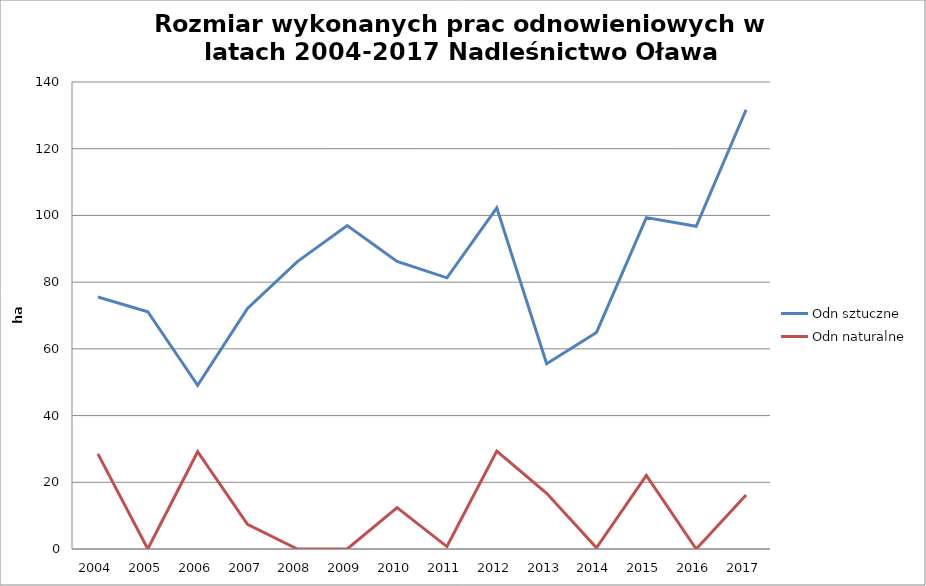
| Category | Odn sztuczne | Odn naturalne |
|---|---|---|
| 2004.0 | 75.55 | 28.52 |
| 2005.0 | 71.13 | 0 |
| 2006.0 | 49.08 | 29.17 |
| 2007.0 | 72.14 | 7.38 |
| 2008.0 | 86.15 | 0 |
| 2009.0 | 96.97 | 0 |
| 2010.0 | 86.23 | 12.41 |
| 2011.0 | 81.3 | 0.73 |
| 2012.0 | 102.29 | 29.37 |
| 2013.0 | 55.54 | 16.68 |
| 2014.0 | 64.92 | 0.36 |
| 2015.0 | 99.36 | 22.09 |
| 2016.0 | 96.75 | 0 |
| 2017.0 | 131.69 | 16.16 |